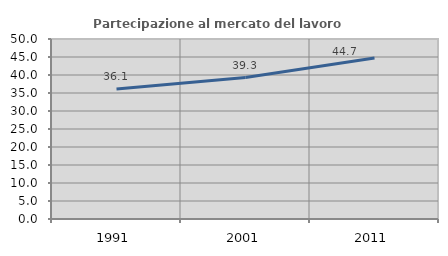
| Category | Partecipazione al mercato del lavoro  femminile |
|---|---|
| 1991.0 | 36.122 |
| 2001.0 | 39.283 |
| 2011.0 | 44.692 |